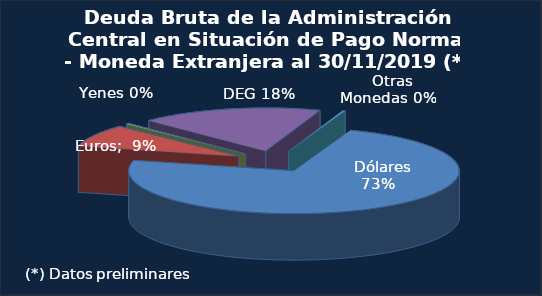
| Category | Series 0 |
|---|---|
|   Dólares | 180396.3 |
|   Euros | 20511.5 |
|   Yenes | 753.8 |
|   DEG | 43827.3 |
|   Otras Monedas | 565 |